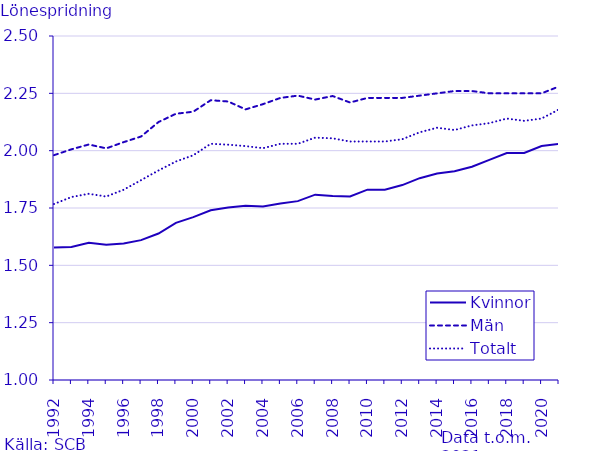
| Category | Kvinnor | Män | Totalt |
|---|---|---|---|
| 1992.0 | 1.578 | 1.98 | 1.768 |
| 1993.0 | 1.58 | 2.006 | 1.798 |
| 1994.0 | 1.598 | 2.027 | 1.812 |
| 1995.0 | 1.59 | 2.01 | 1.8 |
| 1996.0 | 1.596 | 2.037 | 1.83 |
| 1997.0 | 1.61 | 2.062 | 1.871 |
| 1998.0 | 1.639 | 2.125 | 1.914 |
| 1999.0 | 1.685 | 2.161 | 1.953 |
| 2000.0 | 1.71 | 2.17 | 1.98 |
| 2001.0 | 1.74 | 2.22 | 2.03 |
| 2002.0 | 1.752 | 2.214 | 2.026 |
| 2003.0 | 1.76 | 2.18 | 2.02 |
| 2004.0 | 1.756 | 2.203 | 2.011 |
| 2005.0 | 1.77 | 2.23 | 2.03 |
| 2006.0 | 1.78 | 2.24 | 2.03 |
| 2007.0 | 1.808 | 2.223 | 2.057 |
| 2008.0 | 1.802 | 2.238 | 2.054 |
| 2009.0 | 1.8 | 2.21 | 2.04 |
| 2010.0 | 1.83 | 2.23 | 2.04 |
| 2011.0 | 1.83 | 2.23 | 2.04 |
| 2012.0 | 1.85 | 2.23 | 2.05 |
| 2013.0 | 1.88 | 2.24 | 2.08 |
| 2014.0 | 1.9 | 2.25 | 2.1 |
| 2015.0 | 1.91 | 2.26 | 2.09 |
| 2016.0 | 1.93 | 2.26 | 2.11 |
| 2017.0 | 1.96 | 2.25 | 2.12 |
| 2018.0 | 1.99 | 2.25 | 2.14 |
| 2019.0 | 1.99 | 2.25 | 2.13 |
| 2020.0 | 2.02 | 2.25 | 2.14 |
| 2021.0 | 2.03 | 2.28 | 2.18 |